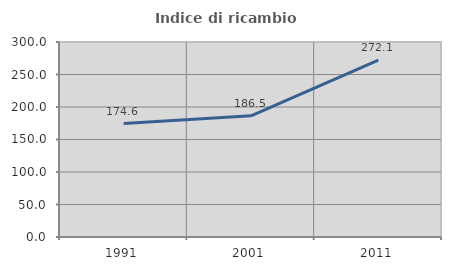
| Category | Indice di ricambio occupazionale  |
|---|---|
| 1991.0 | 174.595 |
| 2001.0 | 186.531 |
| 2011.0 | 272.072 |